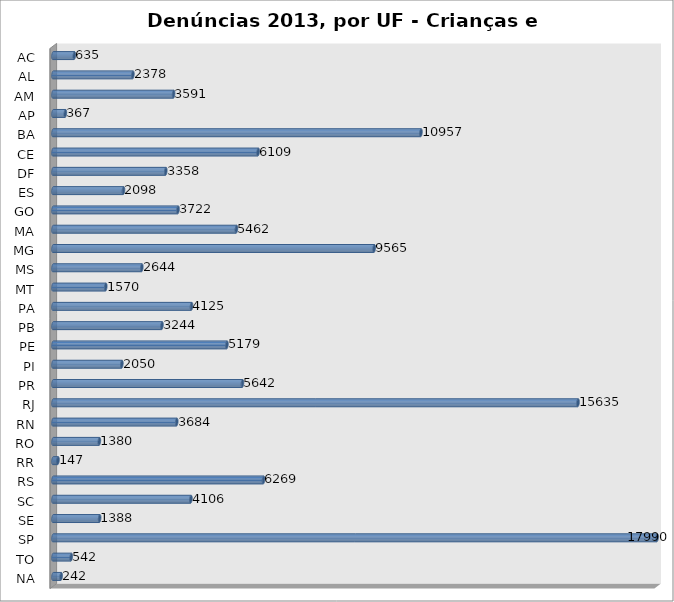
| Category | Series 0 |
|---|---|
| AC | 635 |
| AL | 2378 |
| AM | 3591 |
| AP | 367 |
| BA | 10957 |
| CE | 6109 |
| DF | 3358 |
| ES | 2098 |
| GO | 3722 |
| MA | 5462 |
| MG | 9565 |
| MS | 2644 |
| MT | 1570 |
| PA | 4125 |
| PB | 3244 |
| PE | 5179 |
| PI | 2050 |
| PR | 5642 |
| RJ | 15635 |
| RN | 3684 |
| RO | 1380 |
| RR | 147 |
| RS | 6269 |
| SC | 4106 |
| SE | 1388 |
| SP | 17990 |
| TO | 542 |
| NA | 242 |